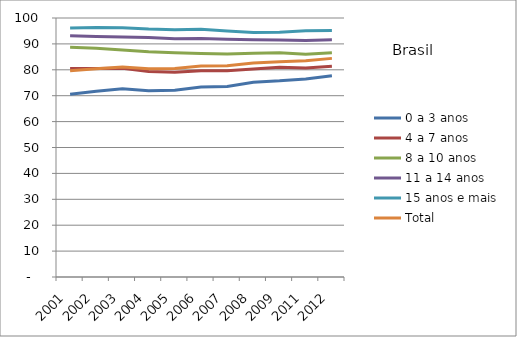
| Category | 0 a 3 anos | 4 a 7 anos | 8 a 10 anos | 11 a 14 anos | 15 anos e mais | Total |
|---|---|---|---|---|---|---|
| 2001 | 70.55 | 80.48 | 88.72 | 93.11 | 96.17 | 79.66 |
| 2002 | 71.71 | 80.49 | 88.35 | 92.88 | 96.38 | 80.43 |
| 2003 | 72.71 | 80.57 | 87.68 | 92.67 | 96.28 | 81.06 |
| 2004 | 71.91 | 79.32 | 86.94 | 92.47 | 95.76 | 80.41 |
| 2005 | 72.12 | 79.06 | 86.55 | 91.98 | 95.5 | 80.52 |
| 2006 | 73.39 | 79.63 | 86.31 | 92.13 | 95.63 | 81.47 |
| 2007 | 73.56 | 79.6 | 86.11 | 91.77 | 95.02 | 81.59 |
| 2008 | 75.22 | 80.32 | 86.4 | 91.59 | 94.37 | 82.59 |
| 2009 | 75.73 | 81.03 | 86.59 | 91.5 | 94.52 | 83.13 |
| 2011 | 76.48 | 80.65 | 85.99 | 91.33 | 95.09 | 83.52 |
| 2012 | 77.68 | 81.4 | 86.6 | 91.58 | 95.2 | 84.41 |